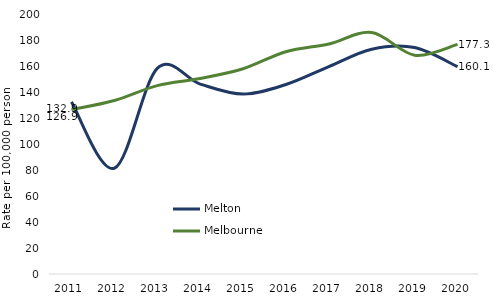
| Category | Melton  | Melbourne  |
|---|---|---|
| 2011.0 | 132.899 | 126.914 |
| 2012.0 | 81.674 | 134.004 |
| 2013.0 | 158.752 | 145.482 |
| 2014.0 | 146.669 | 150.988 |
| 2015.0 | 138.908 | 158.496 |
| 2016.0 | 146.333 | 171.671 |
| 2017.0 | 160.142 | 177.624 |
| 2018.0 | 173.599 | 186.449 |
| 2019.0 | 174.842 | 168.943 |
| 2020.0 | 160.102 | 177.289 |